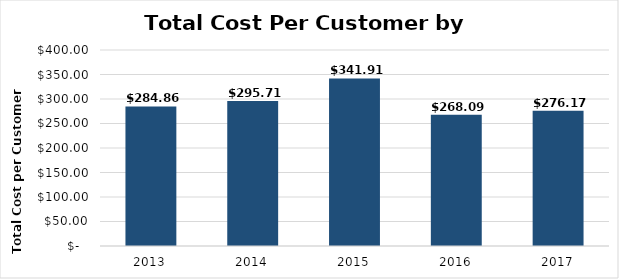
| Category | Series 0 |
|---|---|
| 2013.0 | 284.859 |
| 2014.0 | 295.714 |
| 2015.0 | 341.905 |
| 2016.0 | 268.092 |
| 2017.0 | 276.167 |